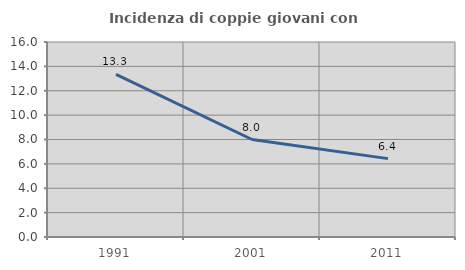
| Category | Incidenza di coppie giovani con figli |
|---|---|
| 1991.0 | 13.341 |
| 2001.0 | 8 |
| 2011.0 | 6.432 |